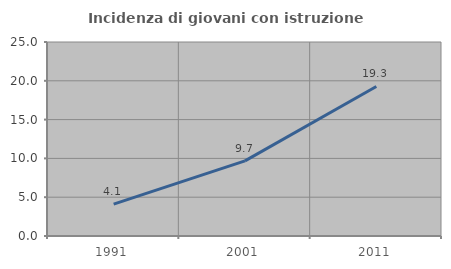
| Category | Incidenza di giovani con istruzione universitaria |
|---|---|
| 1991.0 | 4.106 |
| 2001.0 | 9.681 |
| 2011.0 | 19.271 |